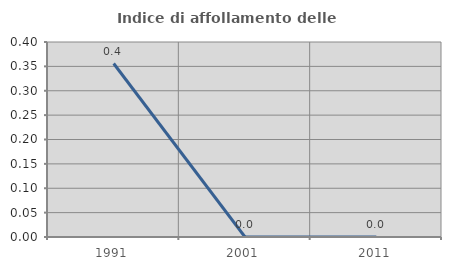
| Category | Indice di affollamento delle abitazioni  |
|---|---|
| 1991.0 | 0.356 |
| 2001.0 | 0 |
| 2011.0 | 0 |